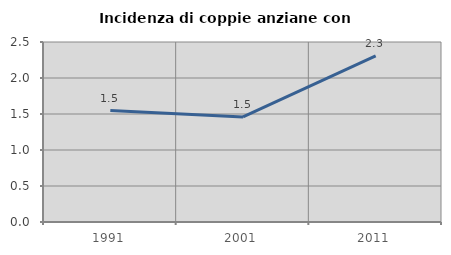
| Category | Incidenza di coppie anziane con figli |
|---|---|
| 1991.0 | 1.548 |
| 2001.0 | 1.46 |
| 2011.0 | 2.306 |